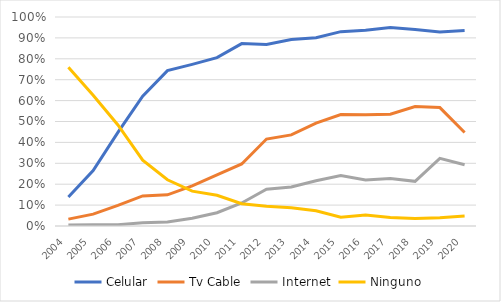
| Category | Celular | Tv Cable | Internet | Ninguno |
|---|---|---|---|---|
| 2004.0 | 0.139 | 0.033 | 0.004 | 0.76 |
| 2005.0 | 0.265 | 0.057 | 0.007 | 0.625 |
| 2006.0 | 0.448 | 0.099 | 0.006 | 0.483 |
| 2007.0 | 0.621 | 0.144 | 0.015 | 0.315 |
| 2008.0 | 0.743 | 0.149 | 0.019 | 0.221 |
| 2009.0 | 0.773 | 0.192 | 0.037 | 0.167 |
| 2010.0 | 0.806 | 0.245 | 0.064 | 0.147 |
| 2011.0 | 0.873 | 0.297 | 0.11 | 0.107 |
| 2012.0 | 0.869 | 0.416 | 0.176 | 0.095 |
| 2013.0 | 0.893 | 0.436 | 0.187 | 0.087 |
| 2014.0 | 0.901 | 0.493 | 0.216 | 0.073 |
| 2015.0 | 0.93 | 0.533 | 0.241 | 0.042 |
| 2016.0 | 0.937 | 0.532 | 0.22 | 0.053 |
| 2017.0 | 0.949 | 0.535 | 0.227 | 0.04 |
| 2018.0 | 0.94 | 0.571 | 0.214 | 0.036 |
| 2019.0 | 0.928 | 0.567 | 0.324 | 0.039 |
| 2020.0 | 0.935 | 0.447 | 0.293 | 0.048 |